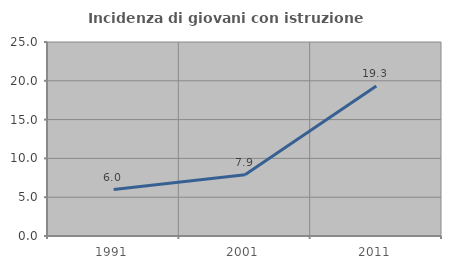
| Category | Incidenza di giovani con istruzione universitaria |
|---|---|
| 1991.0 | 5.991 |
| 2001.0 | 7.881 |
| 2011.0 | 19.335 |